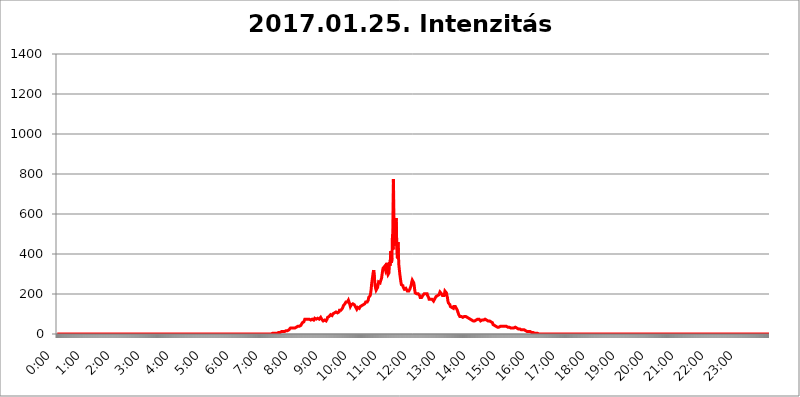
| Category | 2017.01.25. Intenzitás [W/m^2] |
|---|---|
| 0.0 | 0 |
| 0.0006944444444444445 | 0 |
| 0.001388888888888889 | 0 |
| 0.0020833333333333333 | 0 |
| 0.002777777777777778 | 0 |
| 0.003472222222222222 | 0 |
| 0.004166666666666667 | 0 |
| 0.004861111111111111 | 0 |
| 0.005555555555555556 | 0 |
| 0.0062499999999999995 | 0 |
| 0.006944444444444444 | 0 |
| 0.007638888888888889 | 0 |
| 0.008333333333333333 | 0 |
| 0.009027777777777779 | 0 |
| 0.009722222222222222 | 0 |
| 0.010416666666666666 | 0 |
| 0.011111111111111112 | 0 |
| 0.011805555555555555 | 0 |
| 0.012499999999999999 | 0 |
| 0.013194444444444444 | 0 |
| 0.013888888888888888 | 0 |
| 0.014583333333333332 | 0 |
| 0.015277777777777777 | 0 |
| 0.015972222222222224 | 0 |
| 0.016666666666666666 | 0 |
| 0.017361111111111112 | 0 |
| 0.018055555555555557 | 0 |
| 0.01875 | 0 |
| 0.019444444444444445 | 0 |
| 0.02013888888888889 | 0 |
| 0.020833333333333332 | 0 |
| 0.02152777777777778 | 0 |
| 0.022222222222222223 | 0 |
| 0.02291666666666667 | 0 |
| 0.02361111111111111 | 0 |
| 0.024305555555555556 | 0 |
| 0.024999999999999998 | 0 |
| 0.025694444444444447 | 0 |
| 0.02638888888888889 | 0 |
| 0.027083333333333334 | 0 |
| 0.027777777777777776 | 0 |
| 0.02847222222222222 | 0 |
| 0.029166666666666664 | 0 |
| 0.029861111111111113 | 0 |
| 0.030555555555555555 | 0 |
| 0.03125 | 0 |
| 0.03194444444444445 | 0 |
| 0.03263888888888889 | 0 |
| 0.03333333333333333 | 0 |
| 0.034027777777777775 | 0 |
| 0.034722222222222224 | 0 |
| 0.035416666666666666 | 0 |
| 0.036111111111111115 | 0 |
| 0.03680555555555556 | 0 |
| 0.0375 | 0 |
| 0.03819444444444444 | 0 |
| 0.03888888888888889 | 0 |
| 0.03958333333333333 | 0 |
| 0.04027777777777778 | 0 |
| 0.04097222222222222 | 0 |
| 0.041666666666666664 | 0 |
| 0.042361111111111106 | 0 |
| 0.04305555555555556 | 0 |
| 0.043750000000000004 | 0 |
| 0.044444444444444446 | 0 |
| 0.04513888888888889 | 0 |
| 0.04583333333333334 | 0 |
| 0.04652777777777778 | 0 |
| 0.04722222222222222 | 0 |
| 0.04791666666666666 | 0 |
| 0.04861111111111111 | 0 |
| 0.049305555555555554 | 0 |
| 0.049999999999999996 | 0 |
| 0.05069444444444445 | 0 |
| 0.051388888888888894 | 0 |
| 0.052083333333333336 | 0 |
| 0.05277777777777778 | 0 |
| 0.05347222222222222 | 0 |
| 0.05416666666666667 | 0 |
| 0.05486111111111111 | 0 |
| 0.05555555555555555 | 0 |
| 0.05625 | 0 |
| 0.05694444444444444 | 0 |
| 0.057638888888888885 | 0 |
| 0.05833333333333333 | 0 |
| 0.05902777777777778 | 0 |
| 0.059722222222222225 | 0 |
| 0.06041666666666667 | 0 |
| 0.061111111111111116 | 0 |
| 0.06180555555555556 | 0 |
| 0.0625 | 0 |
| 0.06319444444444444 | 0 |
| 0.06388888888888888 | 0 |
| 0.06458333333333334 | 0 |
| 0.06527777777777778 | 0 |
| 0.06597222222222222 | 0 |
| 0.06666666666666667 | 0 |
| 0.06736111111111111 | 0 |
| 0.06805555555555555 | 0 |
| 0.06874999999999999 | 0 |
| 0.06944444444444443 | 0 |
| 0.07013888888888889 | 0 |
| 0.07083333333333333 | 0 |
| 0.07152777777777779 | 0 |
| 0.07222222222222223 | 0 |
| 0.07291666666666667 | 0 |
| 0.07361111111111111 | 0 |
| 0.07430555555555556 | 0 |
| 0.075 | 0 |
| 0.07569444444444444 | 0 |
| 0.0763888888888889 | 0 |
| 0.07708333333333334 | 0 |
| 0.07777777777777778 | 0 |
| 0.07847222222222222 | 0 |
| 0.07916666666666666 | 0 |
| 0.0798611111111111 | 0 |
| 0.08055555555555556 | 0 |
| 0.08125 | 0 |
| 0.08194444444444444 | 0 |
| 0.08263888888888889 | 0 |
| 0.08333333333333333 | 0 |
| 0.08402777777777777 | 0 |
| 0.08472222222222221 | 0 |
| 0.08541666666666665 | 0 |
| 0.08611111111111112 | 0 |
| 0.08680555555555557 | 0 |
| 0.08750000000000001 | 0 |
| 0.08819444444444445 | 0 |
| 0.08888888888888889 | 0 |
| 0.08958333333333333 | 0 |
| 0.09027777777777778 | 0 |
| 0.09097222222222222 | 0 |
| 0.09166666666666667 | 0 |
| 0.09236111111111112 | 0 |
| 0.09305555555555556 | 0 |
| 0.09375 | 0 |
| 0.09444444444444444 | 0 |
| 0.09513888888888888 | 0 |
| 0.09583333333333333 | 0 |
| 0.09652777777777777 | 0 |
| 0.09722222222222222 | 0 |
| 0.09791666666666667 | 0 |
| 0.09861111111111111 | 0 |
| 0.09930555555555555 | 0 |
| 0.09999999999999999 | 0 |
| 0.10069444444444443 | 0 |
| 0.1013888888888889 | 0 |
| 0.10208333333333335 | 0 |
| 0.10277777777777779 | 0 |
| 0.10347222222222223 | 0 |
| 0.10416666666666667 | 0 |
| 0.10486111111111111 | 0 |
| 0.10555555555555556 | 0 |
| 0.10625 | 0 |
| 0.10694444444444444 | 0 |
| 0.1076388888888889 | 0 |
| 0.10833333333333334 | 0 |
| 0.10902777777777778 | 0 |
| 0.10972222222222222 | 0 |
| 0.1111111111111111 | 0 |
| 0.11180555555555556 | 0 |
| 0.11180555555555556 | 0 |
| 0.1125 | 0 |
| 0.11319444444444444 | 0 |
| 0.11388888888888889 | 0 |
| 0.11458333333333333 | 0 |
| 0.11527777777777777 | 0 |
| 0.11597222222222221 | 0 |
| 0.11666666666666665 | 0 |
| 0.1173611111111111 | 0 |
| 0.11805555555555557 | 0 |
| 0.11944444444444445 | 0 |
| 0.12013888888888889 | 0 |
| 0.12083333333333333 | 0 |
| 0.12152777777777778 | 0 |
| 0.12222222222222223 | 0 |
| 0.12291666666666667 | 0 |
| 0.12291666666666667 | 0 |
| 0.12361111111111112 | 0 |
| 0.12430555555555556 | 0 |
| 0.125 | 0 |
| 0.12569444444444444 | 0 |
| 0.12638888888888888 | 0 |
| 0.12708333333333333 | 0 |
| 0.16875 | 0 |
| 0.12847222222222224 | 0 |
| 0.12916666666666668 | 0 |
| 0.12986111111111112 | 0 |
| 0.13055555555555556 | 0 |
| 0.13125 | 0 |
| 0.13194444444444445 | 0 |
| 0.1326388888888889 | 0 |
| 0.13333333333333333 | 0 |
| 0.13402777777777777 | 0 |
| 0.13402777777777777 | 0 |
| 0.13472222222222222 | 0 |
| 0.13541666666666666 | 0 |
| 0.1361111111111111 | 0 |
| 0.13749999999999998 | 0 |
| 0.13819444444444443 | 0 |
| 0.1388888888888889 | 0 |
| 0.13958333333333334 | 0 |
| 0.14027777777777778 | 0 |
| 0.14097222222222222 | 0 |
| 0.14166666666666666 | 0 |
| 0.1423611111111111 | 0 |
| 0.14305555555555557 | 0 |
| 0.14375000000000002 | 0 |
| 0.14444444444444446 | 0 |
| 0.1451388888888889 | 0 |
| 0.1451388888888889 | 0 |
| 0.14652777777777778 | 0 |
| 0.14722222222222223 | 0 |
| 0.14791666666666667 | 0 |
| 0.1486111111111111 | 0 |
| 0.14930555555555555 | 0 |
| 0.15 | 0 |
| 0.15069444444444444 | 0 |
| 0.15138888888888888 | 0 |
| 0.15208333333333332 | 0 |
| 0.15277777777777776 | 0 |
| 0.15347222222222223 | 0 |
| 0.15416666666666667 | 0 |
| 0.15486111111111112 | 0 |
| 0.15555555555555556 | 0 |
| 0.15625 | 0 |
| 0.15694444444444444 | 0 |
| 0.15763888888888888 | 0 |
| 0.15833333333333333 | 0 |
| 0.15902777777777777 | 0 |
| 0.15972222222222224 | 0 |
| 0.16041666666666668 | 0 |
| 0.16111111111111112 | 0 |
| 0.16180555555555556 | 0 |
| 0.1625 | 0 |
| 0.16319444444444445 | 0 |
| 0.1638888888888889 | 0 |
| 0.16458333333333333 | 0 |
| 0.16527777777777777 | 0 |
| 0.16597222222222222 | 0 |
| 0.16666666666666666 | 0 |
| 0.1673611111111111 | 0 |
| 0.16805555555555554 | 0 |
| 0.16874999999999998 | 0 |
| 0.16944444444444443 | 0 |
| 0.17013888888888887 | 0 |
| 0.1708333333333333 | 0 |
| 0.17152777777777775 | 0 |
| 0.17222222222222225 | 0 |
| 0.1729166666666667 | 0 |
| 0.17361111111111113 | 0 |
| 0.17430555555555557 | 0 |
| 0.17500000000000002 | 0 |
| 0.17569444444444446 | 0 |
| 0.1763888888888889 | 0 |
| 0.17708333333333334 | 0 |
| 0.17777777777777778 | 0 |
| 0.17847222222222223 | 0 |
| 0.17916666666666667 | 0 |
| 0.1798611111111111 | 0 |
| 0.18055555555555555 | 0 |
| 0.18125 | 0 |
| 0.18194444444444444 | 0 |
| 0.1826388888888889 | 0 |
| 0.18333333333333335 | 0 |
| 0.1840277777777778 | 0 |
| 0.18472222222222223 | 0 |
| 0.18541666666666667 | 0 |
| 0.18611111111111112 | 0 |
| 0.18680555555555556 | 0 |
| 0.1875 | 0 |
| 0.18819444444444444 | 0 |
| 0.18888888888888888 | 0 |
| 0.18958333333333333 | 0 |
| 0.19027777777777777 | 0 |
| 0.1909722222222222 | 0 |
| 0.19166666666666665 | 0 |
| 0.19236111111111112 | 0 |
| 0.19305555555555554 | 0 |
| 0.19375 | 0 |
| 0.19444444444444445 | 0 |
| 0.1951388888888889 | 0 |
| 0.19583333333333333 | 0 |
| 0.19652777777777777 | 0 |
| 0.19722222222222222 | 0 |
| 0.19791666666666666 | 0 |
| 0.1986111111111111 | 0 |
| 0.19930555555555554 | 0 |
| 0.19999999999999998 | 0 |
| 0.20069444444444443 | 0 |
| 0.20138888888888887 | 0 |
| 0.2020833333333333 | 0 |
| 0.2027777777777778 | 0 |
| 0.2034722222222222 | 0 |
| 0.2041666666666667 | 0 |
| 0.20486111111111113 | 0 |
| 0.20555555555555557 | 0 |
| 0.20625000000000002 | 0 |
| 0.20694444444444446 | 0 |
| 0.2076388888888889 | 0 |
| 0.20833333333333334 | 0 |
| 0.20902777777777778 | 0 |
| 0.20972222222222223 | 0 |
| 0.21041666666666667 | 0 |
| 0.2111111111111111 | 0 |
| 0.21180555555555555 | 0 |
| 0.2125 | 0 |
| 0.21319444444444444 | 0 |
| 0.2138888888888889 | 0 |
| 0.21458333333333335 | 0 |
| 0.2152777777777778 | 0 |
| 0.21597222222222223 | 0 |
| 0.21666666666666667 | 0 |
| 0.21736111111111112 | 0 |
| 0.21805555555555556 | 0 |
| 0.21875 | 0 |
| 0.21944444444444444 | 0 |
| 0.22013888888888888 | 0 |
| 0.22083333333333333 | 0 |
| 0.22152777777777777 | 0 |
| 0.2222222222222222 | 0 |
| 0.22291666666666665 | 0 |
| 0.2236111111111111 | 0 |
| 0.22430555555555556 | 0 |
| 0.225 | 0 |
| 0.22569444444444445 | 0 |
| 0.2263888888888889 | 0 |
| 0.22708333333333333 | 0 |
| 0.22777777777777777 | 0 |
| 0.22847222222222222 | 0 |
| 0.22916666666666666 | 0 |
| 0.2298611111111111 | 0 |
| 0.23055555555555554 | 0 |
| 0.23124999999999998 | 0 |
| 0.23194444444444443 | 0 |
| 0.23263888888888887 | 0 |
| 0.2333333333333333 | 0 |
| 0.2340277777777778 | 0 |
| 0.2347222222222222 | 0 |
| 0.2354166666666667 | 0 |
| 0.23611111111111113 | 0 |
| 0.23680555555555557 | 0 |
| 0.23750000000000002 | 0 |
| 0.23819444444444446 | 0 |
| 0.2388888888888889 | 0 |
| 0.23958333333333334 | 0 |
| 0.24027777777777778 | 0 |
| 0.24097222222222223 | 0 |
| 0.24166666666666667 | 0 |
| 0.2423611111111111 | 0 |
| 0.24305555555555555 | 0 |
| 0.24375 | 0 |
| 0.24444444444444446 | 0 |
| 0.24513888888888888 | 0 |
| 0.24583333333333335 | 0 |
| 0.2465277777777778 | 0 |
| 0.24722222222222223 | 0 |
| 0.24791666666666667 | 0 |
| 0.24861111111111112 | 0 |
| 0.24930555555555556 | 0 |
| 0.25 | 0 |
| 0.25069444444444444 | 0 |
| 0.2513888888888889 | 0 |
| 0.2520833333333333 | 0 |
| 0.25277777777777777 | 0 |
| 0.2534722222222222 | 0 |
| 0.25416666666666665 | 0 |
| 0.2548611111111111 | 0 |
| 0.2555555555555556 | 0 |
| 0.25625000000000003 | 0 |
| 0.2569444444444445 | 0 |
| 0.2576388888888889 | 0 |
| 0.25833333333333336 | 0 |
| 0.2590277777777778 | 0 |
| 0.25972222222222224 | 0 |
| 0.2604166666666667 | 0 |
| 0.2611111111111111 | 0 |
| 0.26180555555555557 | 0 |
| 0.2625 | 0 |
| 0.26319444444444445 | 0 |
| 0.2638888888888889 | 0 |
| 0.26458333333333334 | 0 |
| 0.2652777777777778 | 0 |
| 0.2659722222222222 | 0 |
| 0.26666666666666666 | 0 |
| 0.2673611111111111 | 0 |
| 0.26805555555555555 | 0 |
| 0.26875 | 0 |
| 0.26944444444444443 | 0 |
| 0.2701388888888889 | 0 |
| 0.2708333333333333 | 0 |
| 0.27152777777777776 | 0 |
| 0.2722222222222222 | 0 |
| 0.27291666666666664 | 0 |
| 0.2736111111111111 | 0 |
| 0.2743055555555555 | 0 |
| 0.27499999999999997 | 0 |
| 0.27569444444444446 | 0 |
| 0.27638888888888885 | 0 |
| 0.27708333333333335 | 0 |
| 0.2777777777777778 | 0 |
| 0.27847222222222223 | 0 |
| 0.2791666666666667 | 0 |
| 0.2798611111111111 | 0 |
| 0.28055555555555556 | 0 |
| 0.28125 | 0 |
| 0.28194444444444444 | 0 |
| 0.2826388888888889 | 0 |
| 0.2833333333333333 | 0 |
| 0.28402777777777777 | 0 |
| 0.2847222222222222 | 0 |
| 0.28541666666666665 | 0 |
| 0.28611111111111115 | 0 |
| 0.28680555555555554 | 0 |
| 0.28750000000000003 | 0 |
| 0.2881944444444445 | 0 |
| 0.2888888888888889 | 0 |
| 0.28958333333333336 | 0 |
| 0.2902777777777778 | 0 |
| 0.29097222222222224 | 0 |
| 0.2916666666666667 | 0 |
| 0.2923611111111111 | 0 |
| 0.29305555555555557 | 0 |
| 0.29375 | 0 |
| 0.29444444444444445 | 0 |
| 0.2951388888888889 | 0 |
| 0.29583333333333334 | 0 |
| 0.2965277777777778 | 0 |
| 0.2972222222222222 | 0 |
| 0.29791666666666666 | 0 |
| 0.2986111111111111 | 0 |
| 0.29930555555555555 | 0 |
| 0.3 | 0 |
| 0.30069444444444443 | 0 |
| 0.3013888888888889 | 3.525 |
| 0.3020833333333333 | 3.525 |
| 0.30277777777777776 | 3.525 |
| 0.3034722222222222 | 3.525 |
| 0.30416666666666664 | 3.525 |
| 0.3048611111111111 | 3.525 |
| 0.3055555555555555 | 3.525 |
| 0.30624999999999997 | 3.525 |
| 0.3069444444444444 | 3.525 |
| 0.3076388888888889 | 3.525 |
| 0.30833333333333335 | 3.525 |
| 0.3090277777777778 | 3.525 |
| 0.30972222222222223 | 7.887 |
| 0.3104166666666667 | 7.887 |
| 0.3111111111111111 | 7.887 |
| 0.31180555555555556 | 7.887 |
| 0.3125 | 7.887 |
| 0.31319444444444444 | 7.887 |
| 0.3138888888888889 | 7.887 |
| 0.3145833333333333 | 12.257 |
| 0.31527777777777777 | 12.257 |
| 0.3159722222222222 | 12.257 |
| 0.31666666666666665 | 12.257 |
| 0.31736111111111115 | 12.257 |
| 0.31805555555555554 | 12.257 |
| 0.31875000000000003 | 12.257 |
| 0.3194444444444445 | 12.257 |
| 0.3201388888888889 | 16.636 |
| 0.32083333333333336 | 16.636 |
| 0.3215277777777778 | 16.636 |
| 0.32222222222222224 | 16.636 |
| 0.3229166666666667 | 16.636 |
| 0.3236111111111111 | 21.024 |
| 0.32430555555555557 | 21.024 |
| 0.325 | 21.024 |
| 0.32569444444444445 | 21.024 |
| 0.3263888888888889 | 25.419 |
| 0.32708333333333334 | 29.823 |
| 0.3277777777777778 | 29.823 |
| 0.3284722222222222 | 29.823 |
| 0.32916666666666666 | 29.823 |
| 0.3298611111111111 | 25.419 |
| 0.33055555555555555 | 25.419 |
| 0.33125 | 29.823 |
| 0.33194444444444443 | 29.823 |
| 0.3326388888888889 | 29.823 |
| 0.3333333333333333 | 29.823 |
| 0.3340277777777778 | 29.823 |
| 0.3347222222222222 | 34.234 |
| 0.3354166666666667 | 34.234 |
| 0.3361111111111111 | 38.653 |
| 0.3368055555555556 | 38.653 |
| 0.33749999999999997 | 38.653 |
| 0.33819444444444446 | 38.653 |
| 0.33888888888888885 | 38.653 |
| 0.33958333333333335 | 38.653 |
| 0.34027777777777773 | 43.079 |
| 0.34097222222222223 | 43.079 |
| 0.3416666666666666 | 43.079 |
| 0.3423611111111111 | 47.511 |
| 0.3430555555555555 | 47.511 |
| 0.34375 | 56.398 |
| 0.3444444444444445 | 60.85 |
| 0.3451388888888889 | 60.85 |
| 0.3458333333333334 | 60.85 |
| 0.34652777777777777 | 65.31 |
| 0.34722222222222227 | 74.246 |
| 0.34791666666666665 | 78.722 |
| 0.34861111111111115 | 78.722 |
| 0.34930555555555554 | 74.246 |
| 0.35000000000000003 | 69.775 |
| 0.3506944444444444 | 69.775 |
| 0.3513888888888889 | 74.246 |
| 0.3520833333333333 | 74.246 |
| 0.3527777777777778 | 78.722 |
| 0.3534722222222222 | 74.246 |
| 0.3541666666666667 | 69.775 |
| 0.3548611111111111 | 69.775 |
| 0.35555555555555557 | 69.775 |
| 0.35625 | 74.246 |
| 0.35694444444444445 | 74.246 |
| 0.3576388888888889 | 74.246 |
| 0.35833333333333334 | 69.775 |
| 0.3590277777777778 | 69.775 |
| 0.3597222222222222 | 69.775 |
| 0.36041666666666666 | 74.246 |
| 0.3611111111111111 | 78.722 |
| 0.36180555555555555 | 78.722 |
| 0.3625 | 74.246 |
| 0.36319444444444443 | 74.246 |
| 0.3638888888888889 | 74.246 |
| 0.3645833333333333 | 74.246 |
| 0.3652777777777778 | 78.722 |
| 0.3659722222222222 | 78.722 |
| 0.3666666666666667 | 74.246 |
| 0.3673611111111111 | 74.246 |
| 0.3680555555555556 | 74.246 |
| 0.36874999999999997 | 78.722 |
| 0.36944444444444446 | 83.205 |
| 0.37013888888888885 | 78.722 |
| 0.37083333333333335 | 74.246 |
| 0.37152777777777773 | 74.246 |
| 0.37222222222222223 | 69.775 |
| 0.3729166666666666 | 65.31 |
| 0.3736111111111111 | 65.31 |
| 0.3743055555555555 | 65.31 |
| 0.375 | 69.775 |
| 0.3756944444444445 | 65.31 |
| 0.3763888888888889 | 65.31 |
| 0.3770833333333334 | 65.31 |
| 0.37777777777777777 | 69.775 |
| 0.37847222222222227 | 74.246 |
| 0.37916666666666665 | 83.205 |
| 0.37986111111111115 | 83.205 |
| 0.38055555555555554 | 87.692 |
| 0.38125000000000003 | 87.692 |
| 0.3819444444444444 | 87.692 |
| 0.3826388888888889 | 92.184 |
| 0.3833333333333333 | 96.682 |
| 0.3840277777777778 | 96.682 |
| 0.3847222222222222 | 96.682 |
| 0.3854166666666667 | 92.184 |
| 0.3861111111111111 | 96.682 |
| 0.38680555555555557 | 101.184 |
| 0.3875 | 105.69 |
| 0.38819444444444445 | 105.69 |
| 0.3888888888888889 | 105.69 |
| 0.38958333333333334 | 101.184 |
| 0.3902777777777778 | 105.69 |
| 0.3909722222222222 | 110.201 |
| 0.39166666666666666 | 110.201 |
| 0.3923611111111111 | 110.201 |
| 0.39305555555555555 | 105.69 |
| 0.39375 | 105.69 |
| 0.39444444444444443 | 105.69 |
| 0.3951388888888889 | 110.201 |
| 0.3958333333333333 | 119.235 |
| 0.3965277777777778 | 123.758 |
| 0.3972222222222222 | 123.758 |
| 0.3979166666666667 | 119.235 |
| 0.3986111111111111 | 119.235 |
| 0.3993055555555556 | 119.235 |
| 0.39999999999999997 | 128.284 |
| 0.40069444444444446 | 132.814 |
| 0.40138888888888885 | 141.884 |
| 0.40208333333333335 | 146.423 |
| 0.40277777777777773 | 146.423 |
| 0.40347222222222223 | 150.964 |
| 0.4041666666666666 | 155.509 |
| 0.4048611111111111 | 160.056 |
| 0.4055555555555555 | 160.056 |
| 0.40625 | 160.056 |
| 0.4069444444444445 | 160.056 |
| 0.4076388888888889 | 164.605 |
| 0.4083333333333334 | 169.156 |
| 0.40902777777777777 | 169.156 |
| 0.40972222222222227 | 155.509 |
| 0.41041666666666665 | 146.423 |
| 0.41111111111111115 | 137.347 |
| 0.41180555555555554 | 141.884 |
| 0.41250000000000003 | 146.423 |
| 0.4131944444444444 | 150.964 |
| 0.4138888888888889 | 150.964 |
| 0.4145833333333333 | 150.964 |
| 0.4152777777777778 | 150.964 |
| 0.4159722222222222 | 146.423 |
| 0.4166666666666667 | 146.423 |
| 0.4173611111111111 | 146.423 |
| 0.41805555555555557 | 141.884 |
| 0.41875 | 132.814 |
| 0.41944444444444445 | 128.284 |
| 0.4201388888888889 | 123.758 |
| 0.42083333333333334 | 128.284 |
| 0.4215277777777778 | 132.814 |
| 0.4222222222222222 | 128.284 |
| 0.42291666666666666 | 128.284 |
| 0.4236111111111111 | 128.284 |
| 0.42430555555555555 | 132.814 |
| 0.425 | 137.347 |
| 0.42569444444444443 | 137.347 |
| 0.4263888888888889 | 141.884 |
| 0.4270833333333333 | 141.884 |
| 0.4277777777777778 | 141.884 |
| 0.4284722222222222 | 141.884 |
| 0.4291666666666667 | 146.423 |
| 0.4298611111111111 | 146.423 |
| 0.4305555555555556 | 146.423 |
| 0.43124999999999997 | 150.964 |
| 0.43194444444444446 | 155.509 |
| 0.43263888888888885 | 160.056 |
| 0.43333333333333335 | 164.605 |
| 0.43402777777777773 | 164.605 |
| 0.43472222222222223 | 160.056 |
| 0.4354166666666666 | 160.056 |
| 0.4361111111111111 | 169.156 |
| 0.4368055555555555 | 182.82 |
| 0.4375 | 187.378 |
| 0.4381944444444445 | 182.82 |
| 0.4388888888888889 | 191.937 |
| 0.4395833333333334 | 205.62 |
| 0.44027777777777777 | 223.873 |
| 0.44097222222222227 | 251.251 |
| 0.44166666666666665 | 269.49 |
| 0.44236111111111115 | 287.709 |
| 0.44305555555555554 | 305.898 |
| 0.44375000000000003 | 319.517 |
| 0.4444444444444444 | 319.517 |
| 0.4451388888888889 | 269.49 |
| 0.4458333333333333 | 242.127 |
| 0.4465277777777778 | 228.436 |
| 0.4472222222222222 | 219.309 |
| 0.4479166666666667 | 219.309 |
| 0.4486111111111111 | 219.309 |
| 0.44930555555555557 | 233 |
| 0.45 | 246.689 |
| 0.45069444444444445 | 260.373 |
| 0.4513888888888889 | 260.373 |
| 0.45208333333333334 | 255.813 |
| 0.4527777777777778 | 255.813 |
| 0.4534722222222222 | 264.932 |
| 0.45416666666666666 | 269.49 |
| 0.4548611111111111 | 278.603 |
| 0.45555555555555555 | 296.808 |
| 0.45625 | 314.98 |
| 0.45694444444444443 | 328.584 |
| 0.4576388888888889 | 333.113 |
| 0.4583333333333333 | 333.113 |
| 0.4590277777777778 | 337.639 |
| 0.4597222222222222 | 333.113 |
| 0.4604166666666667 | 319.517 |
| 0.4611111111111111 | 328.584 |
| 0.4618055555555556 | 355.712 |
| 0.46249999999999997 | 328.584 |
| 0.46319444444444446 | 305.898 |
| 0.46388888888888885 | 296.808 |
| 0.46458333333333335 | 296.808 |
| 0.46527777777777773 | 305.898 |
| 0.46597222222222223 | 360.221 |
| 0.4666666666666666 | 342.162 |
| 0.4673611111111111 | 342.162 |
| 0.4680555555555555 | 414.035 |
| 0.46875 | 355.712 |
| 0.4694444444444445 | 378.224 |
| 0.4701388888888889 | 497.836 |
| 0.4708333333333334 | 422.943 |
| 0.47152777777777777 | 775.492 |
| 0.47222222222222227 | 440.702 |
| 0.47291666666666665 | 436.27 |
| 0.47361111111111115 | 467.187 |
| 0.47430555555555554 | 449.551 |
| 0.47500000000000003 | 579.542 |
| 0.4756944444444444 | 532.513 |
| 0.4763888888888889 | 414.035 |
| 0.4770833333333333 | 378.224 |
| 0.4777777777777778 | 458.38 |
| 0.4784722222222222 | 396.164 |
| 0.4791666666666667 | 342.162 |
| 0.4798611111111111 | 319.517 |
| 0.48055555555555557 | 296.808 |
| 0.48125 | 278.603 |
| 0.48194444444444445 | 260.373 |
| 0.4826388888888889 | 246.689 |
| 0.48333333333333334 | 246.689 |
| 0.4840277777777778 | 246.689 |
| 0.4847222222222222 | 242.127 |
| 0.48541666666666666 | 233 |
| 0.4861111111111111 | 228.436 |
| 0.48680555555555555 | 223.873 |
| 0.4875 | 223.873 |
| 0.48819444444444443 | 223.873 |
| 0.4888888888888889 | 228.436 |
| 0.4895833333333333 | 228.436 |
| 0.4902777777777778 | 223.873 |
| 0.4909722222222222 | 214.746 |
| 0.4916666666666667 | 210.182 |
| 0.4923611111111111 | 210.182 |
| 0.4930555555555556 | 214.746 |
| 0.49374999999999997 | 219.309 |
| 0.49444444444444446 | 223.873 |
| 0.49513888888888885 | 228.436 |
| 0.49583333333333335 | 237.564 |
| 0.49652777777777773 | 246.689 |
| 0.49722222222222223 | 260.373 |
| 0.4979166666666666 | 269.49 |
| 0.4986111111111111 | 269.49 |
| 0.4993055555555555 | 269.49 |
| 0.5 | 255.813 |
| 0.5006944444444444 | 242.127 |
| 0.5013888888888889 | 219.309 |
| 0.5020833333333333 | 205.62 |
| 0.5027777777777778 | 201.058 |
| 0.5034722222222222 | 201.058 |
| 0.5041666666666667 | 201.058 |
| 0.5048611111111111 | 196.497 |
| 0.5055555555555555 | 196.497 |
| 0.50625 | 201.058 |
| 0.5069444444444444 | 201.058 |
| 0.5076388888888889 | 196.497 |
| 0.5083333333333333 | 191.937 |
| 0.5090277777777777 | 182.82 |
| 0.5097222222222222 | 178.264 |
| 0.5104166666666666 | 178.264 |
| 0.5111111111111112 | 182.82 |
| 0.5118055555555555 | 187.378 |
| 0.5125000000000001 | 191.937 |
| 0.5131944444444444 | 196.497 |
| 0.513888888888889 | 196.497 |
| 0.5145833333333333 | 201.058 |
| 0.5152777777777778 | 196.497 |
| 0.5159722222222222 | 196.497 |
| 0.5166666666666667 | 201.058 |
| 0.517361111111111 | 205.62 |
| 0.5180555555555556 | 205.62 |
| 0.5187499999999999 | 201.058 |
| 0.5194444444444445 | 191.937 |
| 0.5201388888888888 | 191.937 |
| 0.5208333333333334 | 182.82 |
| 0.5215277777777778 | 173.709 |
| 0.5222222222222223 | 173.709 |
| 0.5229166666666667 | 173.709 |
| 0.5236111111111111 | 173.709 |
| 0.5243055555555556 | 173.709 |
| 0.525 | 173.709 |
| 0.5256944444444445 | 173.709 |
| 0.5263888888888889 | 169.156 |
| 0.5270833333333333 | 169.156 |
| 0.5277777777777778 | 164.605 |
| 0.5284722222222222 | 164.605 |
| 0.5291666666666667 | 169.156 |
| 0.5298611111111111 | 178.264 |
| 0.5305555555555556 | 182.82 |
| 0.53125 | 187.378 |
| 0.5319444444444444 | 187.378 |
| 0.5326388888888889 | 191.937 |
| 0.5333333333333333 | 191.937 |
| 0.5340277777777778 | 191.937 |
| 0.5347222222222222 | 196.497 |
| 0.5354166666666667 | 196.497 |
| 0.5361111111111111 | 201.058 |
| 0.5368055555555555 | 210.182 |
| 0.5375 | 214.746 |
| 0.5381944444444444 | 210.182 |
| 0.5388888888888889 | 201.058 |
| 0.5395833333333333 | 196.497 |
| 0.5402777777777777 | 191.937 |
| 0.5409722222222222 | 191.937 |
| 0.5416666666666666 | 191.937 |
| 0.5423611111111112 | 191.937 |
| 0.5430555555555555 | 201.058 |
| 0.5437500000000001 | 214.746 |
| 0.5444444444444444 | 219.309 |
| 0.545138888888889 | 214.746 |
| 0.5458333333333333 | 205.62 |
| 0.5465277777777778 | 191.937 |
| 0.5472222222222222 | 182.82 |
| 0.5479166666666667 | 164.605 |
| 0.548611111111111 | 155.509 |
| 0.5493055555555556 | 155.509 |
| 0.5499999999999999 | 150.964 |
| 0.5506944444444445 | 146.423 |
| 0.5513888888888888 | 137.347 |
| 0.5520833333333334 | 137.347 |
| 0.5527777777777778 | 137.347 |
| 0.5534722222222223 | 132.814 |
| 0.5541666666666667 | 128.284 |
| 0.5548611111111111 | 128.284 |
| 0.5555555555555556 | 128.284 |
| 0.55625 | 137.347 |
| 0.5569444444444445 | 141.884 |
| 0.5576388888888889 | 141.884 |
| 0.5583333333333333 | 137.347 |
| 0.5590277777777778 | 132.814 |
| 0.5597222222222222 | 128.284 |
| 0.5604166666666667 | 123.758 |
| 0.5611111111111111 | 119.235 |
| 0.5618055555555556 | 110.201 |
| 0.5625 | 105.69 |
| 0.5631944444444444 | 96.682 |
| 0.5638888888888889 | 92.184 |
| 0.5645833333333333 | 87.692 |
| 0.5652777777777778 | 87.692 |
| 0.5659722222222222 | 87.692 |
| 0.5666666666666667 | 87.692 |
| 0.5673611111111111 | 87.692 |
| 0.5680555555555555 | 87.692 |
| 0.56875 | 83.205 |
| 0.5694444444444444 | 83.205 |
| 0.5701388888888889 | 87.692 |
| 0.5708333333333333 | 87.692 |
| 0.5715277777777777 | 87.692 |
| 0.5722222222222222 | 87.692 |
| 0.5729166666666666 | 87.692 |
| 0.5736111111111112 | 87.692 |
| 0.5743055555555555 | 87.692 |
| 0.5750000000000001 | 83.205 |
| 0.5756944444444444 | 83.205 |
| 0.576388888888889 | 78.722 |
| 0.5770833333333333 | 78.722 |
| 0.5777777777777778 | 74.246 |
| 0.5784722222222222 | 74.246 |
| 0.5791666666666667 | 74.246 |
| 0.579861111111111 | 74.246 |
| 0.5805555555555556 | 74.246 |
| 0.5812499999999999 | 69.775 |
| 0.5819444444444445 | 69.775 |
| 0.5826388888888888 | 65.31 |
| 0.5833333333333334 | 65.31 |
| 0.5840277777777778 | 65.31 |
| 0.5847222222222223 | 65.31 |
| 0.5854166666666667 | 65.31 |
| 0.5861111111111111 | 69.775 |
| 0.5868055555555556 | 69.775 |
| 0.5875 | 69.775 |
| 0.5881944444444445 | 74.246 |
| 0.5888888888888889 | 74.246 |
| 0.5895833333333333 | 74.246 |
| 0.5902777777777778 | 74.246 |
| 0.5909722222222222 | 74.246 |
| 0.5916666666666667 | 74.246 |
| 0.5923611111111111 | 69.775 |
| 0.5930555555555556 | 69.775 |
| 0.59375 | 65.31 |
| 0.5944444444444444 | 65.31 |
| 0.5951388888888889 | 69.775 |
| 0.5958333333333333 | 69.775 |
| 0.5965277777777778 | 69.775 |
| 0.5972222222222222 | 69.775 |
| 0.5979166666666667 | 69.775 |
| 0.5986111111111111 | 69.775 |
| 0.5993055555555555 | 74.246 |
| 0.6 | 74.246 |
| 0.6006944444444444 | 74.246 |
| 0.6013888888888889 | 69.775 |
| 0.6020833333333333 | 69.775 |
| 0.6027777777777777 | 69.775 |
| 0.6034722222222222 | 69.775 |
| 0.6041666666666666 | 65.31 |
| 0.6048611111111112 | 65.31 |
| 0.6055555555555555 | 65.31 |
| 0.6062500000000001 | 65.31 |
| 0.6069444444444444 | 65.31 |
| 0.607638888888889 | 65.31 |
| 0.6083333333333333 | 60.85 |
| 0.6090277777777778 | 60.85 |
| 0.6097222222222222 | 56.398 |
| 0.6104166666666667 | 56.398 |
| 0.611111111111111 | 47.511 |
| 0.6118055555555556 | 47.511 |
| 0.6124999999999999 | 43.079 |
| 0.6131944444444445 | 43.079 |
| 0.6138888888888888 | 43.079 |
| 0.6145833333333334 | 38.653 |
| 0.6152777777777778 | 38.653 |
| 0.6159722222222223 | 38.653 |
| 0.6166666666666667 | 34.234 |
| 0.6173611111111111 | 34.234 |
| 0.6180555555555556 | 34.234 |
| 0.61875 | 34.234 |
| 0.6194444444444445 | 34.234 |
| 0.6201388888888889 | 38.653 |
| 0.6208333333333333 | 38.653 |
| 0.6215277777777778 | 38.653 |
| 0.6222222222222222 | 38.653 |
| 0.6229166666666667 | 38.653 |
| 0.6236111111111111 | 38.653 |
| 0.6243055555555556 | 38.653 |
| 0.625 | 38.653 |
| 0.6256944444444444 | 38.653 |
| 0.6263888888888889 | 34.234 |
| 0.6270833333333333 | 34.234 |
| 0.6277777777777778 | 38.653 |
| 0.6284722222222222 | 34.234 |
| 0.6291666666666667 | 34.234 |
| 0.6298611111111111 | 38.653 |
| 0.6305555555555555 | 34.234 |
| 0.63125 | 34.234 |
| 0.6319444444444444 | 34.234 |
| 0.6326388888888889 | 34.234 |
| 0.6333333333333333 | 34.234 |
| 0.6340277777777777 | 34.234 |
| 0.6347222222222222 | 34.234 |
| 0.6354166666666666 | 29.823 |
| 0.6361111111111112 | 29.823 |
| 0.6368055555555555 | 29.823 |
| 0.6375000000000001 | 29.823 |
| 0.6381944444444444 | 29.823 |
| 0.638888888888889 | 29.823 |
| 0.6395833333333333 | 29.823 |
| 0.6402777777777778 | 29.823 |
| 0.6409722222222222 | 29.823 |
| 0.6416666666666667 | 34.234 |
| 0.642361111111111 | 34.234 |
| 0.6430555555555556 | 34.234 |
| 0.6437499999999999 | 29.823 |
| 0.6444444444444445 | 29.823 |
| 0.6451388888888888 | 25.419 |
| 0.6458333333333334 | 25.419 |
| 0.6465277777777778 | 25.419 |
| 0.6472222222222223 | 25.419 |
| 0.6479166666666667 | 25.419 |
| 0.6486111111111111 | 25.419 |
| 0.6493055555555556 | 25.419 |
| 0.65 | 21.024 |
| 0.6506944444444445 | 21.024 |
| 0.6513888888888889 | 21.024 |
| 0.6520833333333333 | 21.024 |
| 0.6527777777777778 | 21.024 |
| 0.6534722222222222 | 21.024 |
| 0.6541666666666667 | 21.024 |
| 0.6548611111111111 | 21.024 |
| 0.6555555555555556 | 16.636 |
| 0.65625 | 16.636 |
| 0.6569444444444444 | 16.636 |
| 0.6576388888888889 | 16.636 |
| 0.6583333333333333 | 16.636 |
| 0.6590277777777778 | 12.257 |
| 0.6597222222222222 | 12.257 |
| 0.6604166666666667 | 12.257 |
| 0.6611111111111111 | 12.257 |
| 0.6618055555555555 | 12.257 |
| 0.6625 | 12.257 |
| 0.6631944444444444 | 12.257 |
| 0.6638888888888889 | 12.257 |
| 0.6645833333333333 | 12.257 |
| 0.6652777777777777 | 7.887 |
| 0.6659722222222222 | 7.887 |
| 0.6666666666666666 | 7.887 |
| 0.6673611111111111 | 7.887 |
| 0.6680555555555556 | 7.887 |
| 0.6687500000000001 | 7.887 |
| 0.6694444444444444 | 3.525 |
| 0.6701388888888888 | 3.525 |
| 0.6708333333333334 | 3.525 |
| 0.6715277777777778 | 3.525 |
| 0.6722222222222222 | 3.525 |
| 0.6729166666666666 | 3.525 |
| 0.6736111111111112 | 3.525 |
| 0.6743055555555556 | 3.525 |
| 0.6749999999999999 | 3.525 |
| 0.6756944444444444 | 0 |
| 0.6763888888888889 | 3.525 |
| 0.6770833333333334 | 0 |
| 0.6777777777777777 | 0 |
| 0.6784722222222223 | 0 |
| 0.6791666666666667 | 0 |
| 0.6798611111111111 | 0 |
| 0.6805555555555555 | 0 |
| 0.68125 | 0 |
| 0.6819444444444445 | 0 |
| 0.6826388888888889 | 0 |
| 0.6833333333333332 | 0 |
| 0.6840277777777778 | 0 |
| 0.6847222222222222 | 0 |
| 0.6854166666666667 | 0 |
| 0.686111111111111 | 0 |
| 0.6868055555555556 | 0 |
| 0.6875 | 0 |
| 0.6881944444444444 | 0 |
| 0.688888888888889 | 0 |
| 0.6895833333333333 | 0 |
| 0.6902777777777778 | 0 |
| 0.6909722222222222 | 0 |
| 0.6916666666666668 | 0 |
| 0.6923611111111111 | 0 |
| 0.6930555555555555 | 0 |
| 0.69375 | 0 |
| 0.6944444444444445 | 0 |
| 0.6951388888888889 | 0 |
| 0.6958333333333333 | 0 |
| 0.6965277777777777 | 0 |
| 0.6972222222222223 | 0 |
| 0.6979166666666666 | 0 |
| 0.6986111111111111 | 0 |
| 0.6993055555555556 | 0 |
| 0.7000000000000001 | 0 |
| 0.7006944444444444 | 0 |
| 0.7013888888888888 | 0 |
| 0.7020833333333334 | 0 |
| 0.7027777777777778 | 0 |
| 0.7034722222222222 | 0 |
| 0.7041666666666666 | 0 |
| 0.7048611111111112 | 0 |
| 0.7055555555555556 | 0 |
| 0.7062499999999999 | 0 |
| 0.7069444444444444 | 0 |
| 0.7076388888888889 | 0 |
| 0.7083333333333334 | 0 |
| 0.7090277777777777 | 0 |
| 0.7097222222222223 | 0 |
| 0.7104166666666667 | 0 |
| 0.7111111111111111 | 0 |
| 0.7118055555555555 | 0 |
| 0.7125 | 0 |
| 0.7131944444444445 | 0 |
| 0.7138888888888889 | 0 |
| 0.7145833333333332 | 0 |
| 0.7152777777777778 | 0 |
| 0.7159722222222222 | 0 |
| 0.7166666666666667 | 0 |
| 0.717361111111111 | 0 |
| 0.7180555555555556 | 0 |
| 0.71875 | 0 |
| 0.7194444444444444 | 0 |
| 0.720138888888889 | 0 |
| 0.7208333333333333 | 0 |
| 0.7215277777777778 | 0 |
| 0.7222222222222222 | 0 |
| 0.7229166666666668 | 0 |
| 0.7236111111111111 | 0 |
| 0.7243055555555555 | 0 |
| 0.725 | 0 |
| 0.7256944444444445 | 0 |
| 0.7263888888888889 | 0 |
| 0.7270833333333333 | 0 |
| 0.7277777777777777 | 0 |
| 0.7284722222222223 | 0 |
| 0.7291666666666666 | 0 |
| 0.7298611111111111 | 0 |
| 0.7305555555555556 | 0 |
| 0.7312500000000001 | 0 |
| 0.7319444444444444 | 0 |
| 0.7326388888888888 | 0 |
| 0.7333333333333334 | 0 |
| 0.7340277777777778 | 0 |
| 0.7347222222222222 | 0 |
| 0.7354166666666666 | 0 |
| 0.7361111111111112 | 0 |
| 0.7368055555555556 | 0 |
| 0.7374999999999999 | 0 |
| 0.7381944444444444 | 0 |
| 0.7388888888888889 | 0 |
| 0.7395833333333334 | 0 |
| 0.7402777777777777 | 0 |
| 0.7409722222222223 | 0 |
| 0.7416666666666667 | 0 |
| 0.7423611111111111 | 0 |
| 0.7430555555555555 | 0 |
| 0.74375 | 0 |
| 0.7444444444444445 | 0 |
| 0.7451388888888889 | 0 |
| 0.7458333333333332 | 0 |
| 0.7465277777777778 | 0 |
| 0.7472222222222222 | 0 |
| 0.7479166666666667 | 0 |
| 0.748611111111111 | 0 |
| 0.7493055555555556 | 0 |
| 0.75 | 0 |
| 0.7506944444444444 | 0 |
| 0.751388888888889 | 0 |
| 0.7520833333333333 | 0 |
| 0.7527777777777778 | 0 |
| 0.7534722222222222 | 0 |
| 0.7541666666666668 | 0 |
| 0.7548611111111111 | 0 |
| 0.7555555555555555 | 0 |
| 0.75625 | 0 |
| 0.7569444444444445 | 0 |
| 0.7576388888888889 | 0 |
| 0.7583333333333333 | 0 |
| 0.7590277777777777 | 0 |
| 0.7597222222222223 | 0 |
| 0.7604166666666666 | 0 |
| 0.7611111111111111 | 0 |
| 0.7618055555555556 | 0 |
| 0.7625000000000001 | 0 |
| 0.7631944444444444 | 0 |
| 0.7638888888888888 | 0 |
| 0.7645833333333334 | 0 |
| 0.7652777777777778 | 0 |
| 0.7659722222222222 | 0 |
| 0.7666666666666666 | 0 |
| 0.7673611111111112 | 0 |
| 0.7680555555555556 | 0 |
| 0.7687499999999999 | 0 |
| 0.7694444444444444 | 0 |
| 0.7701388888888889 | 0 |
| 0.7708333333333334 | 0 |
| 0.7715277777777777 | 0 |
| 0.7722222222222223 | 0 |
| 0.7729166666666667 | 0 |
| 0.7736111111111111 | 0 |
| 0.7743055555555555 | 0 |
| 0.775 | 0 |
| 0.7756944444444445 | 0 |
| 0.7763888888888889 | 0 |
| 0.7770833333333332 | 0 |
| 0.7777777777777778 | 0 |
| 0.7784722222222222 | 0 |
| 0.7791666666666667 | 0 |
| 0.779861111111111 | 0 |
| 0.7805555555555556 | 0 |
| 0.78125 | 0 |
| 0.7819444444444444 | 0 |
| 0.782638888888889 | 0 |
| 0.7833333333333333 | 0 |
| 0.7840277777777778 | 0 |
| 0.7847222222222222 | 0 |
| 0.7854166666666668 | 0 |
| 0.7861111111111111 | 0 |
| 0.7868055555555555 | 0 |
| 0.7875 | 0 |
| 0.7881944444444445 | 0 |
| 0.7888888888888889 | 0 |
| 0.7895833333333333 | 0 |
| 0.7902777777777777 | 0 |
| 0.7909722222222223 | 0 |
| 0.7916666666666666 | 0 |
| 0.7923611111111111 | 0 |
| 0.7930555555555556 | 0 |
| 0.7937500000000001 | 0 |
| 0.7944444444444444 | 0 |
| 0.7951388888888888 | 0 |
| 0.7958333333333334 | 0 |
| 0.7965277777777778 | 0 |
| 0.7972222222222222 | 0 |
| 0.7979166666666666 | 0 |
| 0.7986111111111112 | 0 |
| 0.7993055555555556 | 0 |
| 0.7999999999999999 | 0 |
| 0.8006944444444444 | 0 |
| 0.8013888888888889 | 0 |
| 0.8020833333333334 | 0 |
| 0.8027777777777777 | 0 |
| 0.8034722222222223 | 0 |
| 0.8041666666666667 | 0 |
| 0.8048611111111111 | 0 |
| 0.8055555555555555 | 0 |
| 0.80625 | 0 |
| 0.8069444444444445 | 0 |
| 0.8076388888888889 | 0 |
| 0.8083333333333332 | 0 |
| 0.8090277777777778 | 0 |
| 0.8097222222222222 | 0 |
| 0.8104166666666667 | 0 |
| 0.811111111111111 | 0 |
| 0.8118055555555556 | 0 |
| 0.8125 | 0 |
| 0.8131944444444444 | 0 |
| 0.813888888888889 | 0 |
| 0.8145833333333333 | 0 |
| 0.8152777777777778 | 0 |
| 0.8159722222222222 | 0 |
| 0.8166666666666668 | 0 |
| 0.8173611111111111 | 0 |
| 0.8180555555555555 | 0 |
| 0.81875 | 0 |
| 0.8194444444444445 | 0 |
| 0.8201388888888889 | 0 |
| 0.8208333333333333 | 0 |
| 0.8215277777777777 | 0 |
| 0.8222222222222223 | 0 |
| 0.8229166666666666 | 0 |
| 0.8236111111111111 | 0 |
| 0.8243055555555556 | 0 |
| 0.8250000000000001 | 0 |
| 0.8256944444444444 | 0 |
| 0.8263888888888888 | 0 |
| 0.8270833333333334 | 0 |
| 0.8277777777777778 | 0 |
| 0.8284722222222222 | 0 |
| 0.8291666666666666 | 0 |
| 0.8298611111111112 | 0 |
| 0.8305555555555556 | 0 |
| 0.8312499999999999 | 0 |
| 0.8319444444444444 | 0 |
| 0.8326388888888889 | 0 |
| 0.8333333333333334 | 0 |
| 0.8340277777777777 | 0 |
| 0.8347222222222223 | 0 |
| 0.8354166666666667 | 0 |
| 0.8361111111111111 | 0 |
| 0.8368055555555555 | 0 |
| 0.8375 | 0 |
| 0.8381944444444445 | 0 |
| 0.8388888888888889 | 0 |
| 0.8395833333333332 | 0 |
| 0.8402777777777778 | 0 |
| 0.8409722222222222 | 0 |
| 0.8416666666666667 | 0 |
| 0.842361111111111 | 0 |
| 0.8430555555555556 | 0 |
| 0.84375 | 0 |
| 0.8444444444444444 | 0 |
| 0.845138888888889 | 0 |
| 0.8458333333333333 | 0 |
| 0.8465277777777778 | 0 |
| 0.8472222222222222 | 0 |
| 0.8479166666666668 | 0 |
| 0.8486111111111111 | 0 |
| 0.8493055555555555 | 0 |
| 0.85 | 0 |
| 0.8506944444444445 | 0 |
| 0.8513888888888889 | 0 |
| 0.8520833333333333 | 0 |
| 0.8527777777777777 | 0 |
| 0.8534722222222223 | 0 |
| 0.8541666666666666 | 0 |
| 0.8548611111111111 | 0 |
| 0.8555555555555556 | 0 |
| 0.8562500000000001 | 0 |
| 0.8569444444444444 | 0 |
| 0.8576388888888888 | 0 |
| 0.8583333333333334 | 0 |
| 0.8590277777777778 | 0 |
| 0.8597222222222222 | 0 |
| 0.8604166666666666 | 0 |
| 0.8611111111111112 | 0 |
| 0.8618055555555556 | 0 |
| 0.8624999999999999 | 0 |
| 0.8631944444444444 | 0 |
| 0.8638888888888889 | 0 |
| 0.8645833333333334 | 0 |
| 0.8652777777777777 | 0 |
| 0.8659722222222223 | 0 |
| 0.8666666666666667 | 0 |
| 0.8673611111111111 | 0 |
| 0.8680555555555555 | 0 |
| 0.86875 | 0 |
| 0.8694444444444445 | 0 |
| 0.8701388888888889 | 0 |
| 0.8708333333333332 | 0 |
| 0.8715277777777778 | 0 |
| 0.8722222222222222 | 0 |
| 0.8729166666666667 | 0 |
| 0.873611111111111 | 0 |
| 0.8743055555555556 | 0 |
| 0.875 | 0 |
| 0.8756944444444444 | 0 |
| 0.876388888888889 | 0 |
| 0.8770833333333333 | 0 |
| 0.8777777777777778 | 0 |
| 0.8784722222222222 | 0 |
| 0.8791666666666668 | 0 |
| 0.8798611111111111 | 0 |
| 0.8805555555555555 | 0 |
| 0.88125 | 0 |
| 0.8819444444444445 | 0 |
| 0.8826388888888889 | 0 |
| 0.8833333333333333 | 0 |
| 0.8840277777777777 | 0 |
| 0.8847222222222223 | 0 |
| 0.8854166666666666 | 0 |
| 0.8861111111111111 | 0 |
| 0.8868055555555556 | 0 |
| 0.8875000000000001 | 0 |
| 0.8881944444444444 | 0 |
| 0.8888888888888888 | 0 |
| 0.8895833333333334 | 0 |
| 0.8902777777777778 | 0 |
| 0.8909722222222222 | 0 |
| 0.8916666666666666 | 0 |
| 0.8923611111111112 | 0 |
| 0.8930555555555556 | 0 |
| 0.8937499999999999 | 0 |
| 0.8944444444444444 | 0 |
| 0.8951388888888889 | 0 |
| 0.8958333333333334 | 0 |
| 0.8965277777777777 | 0 |
| 0.8972222222222223 | 0 |
| 0.8979166666666667 | 0 |
| 0.8986111111111111 | 0 |
| 0.8993055555555555 | 0 |
| 0.9 | 0 |
| 0.9006944444444445 | 0 |
| 0.9013888888888889 | 0 |
| 0.9020833333333332 | 0 |
| 0.9027777777777778 | 0 |
| 0.9034722222222222 | 0 |
| 0.9041666666666667 | 0 |
| 0.904861111111111 | 0 |
| 0.9055555555555556 | 0 |
| 0.90625 | 0 |
| 0.9069444444444444 | 0 |
| 0.907638888888889 | 0 |
| 0.9083333333333333 | 0 |
| 0.9090277777777778 | 0 |
| 0.9097222222222222 | 0 |
| 0.9104166666666668 | 0 |
| 0.9111111111111111 | 0 |
| 0.9118055555555555 | 0 |
| 0.9125 | 0 |
| 0.9131944444444445 | 0 |
| 0.9138888888888889 | 0 |
| 0.9145833333333333 | 0 |
| 0.9152777777777777 | 0 |
| 0.9159722222222223 | 0 |
| 0.9166666666666666 | 0 |
| 0.9173611111111111 | 0 |
| 0.9180555555555556 | 0 |
| 0.9187500000000001 | 0 |
| 0.9194444444444444 | 0 |
| 0.9201388888888888 | 0 |
| 0.9208333333333334 | 0 |
| 0.9215277777777778 | 0 |
| 0.9222222222222222 | 0 |
| 0.9229166666666666 | 0 |
| 0.9236111111111112 | 0 |
| 0.9243055555555556 | 0 |
| 0.9249999999999999 | 0 |
| 0.9256944444444444 | 0 |
| 0.9263888888888889 | 0 |
| 0.9270833333333334 | 0 |
| 0.9277777777777777 | 0 |
| 0.9284722222222223 | 0 |
| 0.9291666666666667 | 0 |
| 0.9298611111111111 | 0 |
| 0.9305555555555555 | 0 |
| 0.93125 | 0 |
| 0.9319444444444445 | 0 |
| 0.9326388888888889 | 0 |
| 0.9333333333333332 | 0 |
| 0.9340277777777778 | 0 |
| 0.9347222222222222 | 0 |
| 0.9354166666666667 | 0 |
| 0.936111111111111 | 0 |
| 0.9368055555555556 | 0 |
| 0.9375 | 0 |
| 0.9381944444444444 | 0 |
| 0.938888888888889 | 0 |
| 0.9395833333333333 | 0 |
| 0.9402777777777778 | 0 |
| 0.9409722222222222 | 0 |
| 0.9416666666666668 | 0 |
| 0.9423611111111111 | 0 |
| 0.9430555555555555 | 0 |
| 0.94375 | 0 |
| 0.9444444444444445 | 0 |
| 0.9451388888888889 | 0 |
| 0.9458333333333333 | 0 |
| 0.9465277777777777 | 0 |
| 0.9472222222222223 | 0 |
| 0.9479166666666666 | 0 |
| 0.9486111111111111 | 0 |
| 0.9493055555555556 | 0 |
| 0.9500000000000001 | 0 |
| 0.9506944444444444 | 0 |
| 0.9513888888888888 | 0 |
| 0.9520833333333334 | 0 |
| 0.9527777777777778 | 0 |
| 0.9534722222222222 | 0 |
| 0.9541666666666666 | 0 |
| 0.9548611111111112 | 0 |
| 0.9555555555555556 | 0 |
| 0.9562499999999999 | 0 |
| 0.9569444444444444 | 0 |
| 0.9576388888888889 | 0 |
| 0.9583333333333334 | 0 |
| 0.9590277777777777 | 0 |
| 0.9597222222222223 | 0 |
| 0.9604166666666667 | 0 |
| 0.9611111111111111 | 0 |
| 0.9618055555555555 | 0 |
| 0.9625 | 0 |
| 0.9631944444444445 | 0 |
| 0.9638888888888889 | 0 |
| 0.9645833333333332 | 0 |
| 0.9652777777777778 | 0 |
| 0.9659722222222222 | 0 |
| 0.9666666666666667 | 0 |
| 0.967361111111111 | 0 |
| 0.9680555555555556 | 0 |
| 0.96875 | 0 |
| 0.9694444444444444 | 0 |
| 0.970138888888889 | 0 |
| 0.9708333333333333 | 0 |
| 0.9715277777777778 | 0 |
| 0.9722222222222222 | 0 |
| 0.9729166666666668 | 0 |
| 0.9736111111111111 | 0 |
| 0.9743055555555555 | 0 |
| 0.975 | 0 |
| 0.9756944444444445 | 0 |
| 0.9763888888888889 | 0 |
| 0.9770833333333333 | 0 |
| 0.9777777777777777 | 0 |
| 0.9784722222222223 | 0 |
| 0.9791666666666666 | 0 |
| 0.9798611111111111 | 0 |
| 0.9805555555555556 | 0 |
| 0.9812500000000001 | 0 |
| 0.9819444444444444 | 0 |
| 0.9826388888888888 | 0 |
| 0.9833333333333334 | 0 |
| 0.9840277777777778 | 0 |
| 0.9847222222222222 | 0 |
| 0.9854166666666666 | 0 |
| 0.9861111111111112 | 0 |
| 0.9868055555555556 | 0 |
| 0.9874999999999999 | 0 |
| 0.9881944444444444 | 0 |
| 0.9888888888888889 | 0 |
| 0.9895833333333334 | 0 |
| 0.9902777777777777 | 0 |
| 0.9909722222222223 | 0 |
| 0.9916666666666667 | 0 |
| 0.9923611111111111 | 0 |
| 0.9930555555555555 | 0 |
| 0.99375 | 0 |
| 0.9944444444444445 | 0 |
| 0.9951388888888889 | 0 |
| 0.9958333333333332 | 0 |
| 0.9965277777777778 | 0 |
| 0.9972222222222222 | 0 |
| 0.9979166666666667 | 0 |
| 0.998611111111111 | 0 |
| 0.9993055555555556 | 0 |